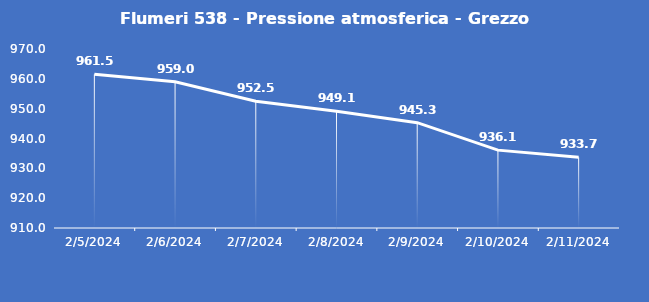
| Category | Flumeri 538 - Pressione atmosferica - Grezzo (hPa) |
|---|---|
| 2/5/24 | 961.5 |
| 2/6/24 | 959 |
| 2/7/24 | 952.5 |
| 2/8/24 | 949.1 |
| 2/9/24 | 945.3 |
| 2/10/24 | 936.1 |
| 2/11/24 | 933.7 |